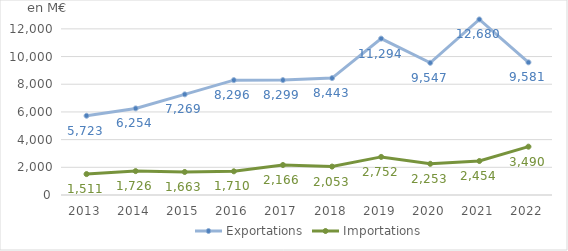
| Category | Exportations | Importations |
|---|---|---|
| 2013 | 5723 | 1511 |
| 2014 | 6254 | 1726 |
| 2015 | 7269 | 1663 |
| 2016 | 8296.374 | 1710.28 |
| 2017 | 8299 | 2166 |
| 2018 | 8443 | 2053 |
| 2019 | 11294.434 | 2751.543 |
| 2020 | 9547.466 | 2252.965 |
| 2021 | 12680 | 2454 |
| 2022 | 9581 | 3490 |